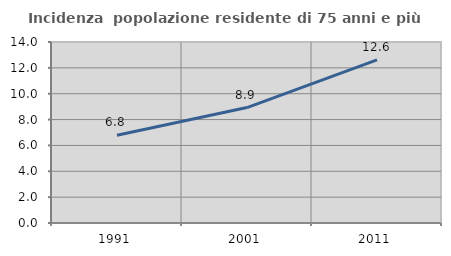
| Category | Incidenza  popolazione residente di 75 anni e più |
|---|---|
| 1991.0 | 6.79 |
| 2001.0 | 8.928 |
| 2011.0 | 12.619 |